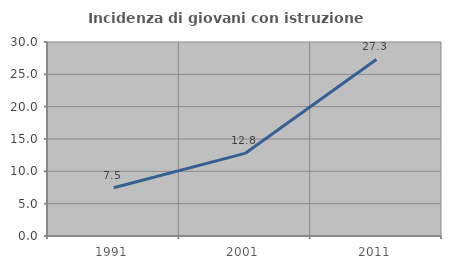
| Category | Incidenza di giovani con istruzione universitaria |
|---|---|
| 1991.0 | 7.451 |
| 2001.0 | 12.772 |
| 2011.0 | 27.301 |